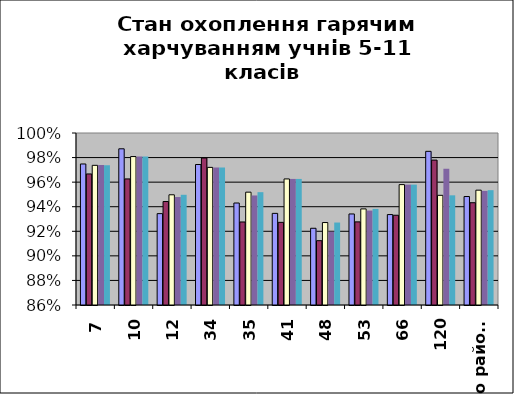
| Category | Series 0 | Series 1 | Series 2 | Series 3 | Series 4 |
|---|---|---|---|---|---|
| 7 | 0.975 | 0.967 | 0.974 | 0.974 | 0.974 |
| 10 | 0.987 | 0.963 | 0.981 | 0.981 | 0.981 |
| 12 | 0.934 | 0.944 | 0.95 | 0.948 | 0.95 |
| 34 | 0.974 | 0.98 | 0.972 | 0.972 | 0.972 |
| 35 | 0.943 | 0.928 | 0.952 | 0.949 | 0.952 |
| 41 | 0.935 | 0.927 | 0.963 | 0.963 | 0.963 |
| 48 | 0.922 | 0.912 | 0.927 | 0.92 | 0.927 |
| 53 | 0.934 | 0.928 | 0.938 | 0.937 | 0.938 |
| 66 | 0.934 | 0.933 | 0.958 | 0.958 | 0.958 |
| 120 | 0.985 | 0.978 | 0.949 | 0.971 | 0.949 |
| по району | 0.948 | 0.943 | 0.953 | 0.953 | 0.953 |